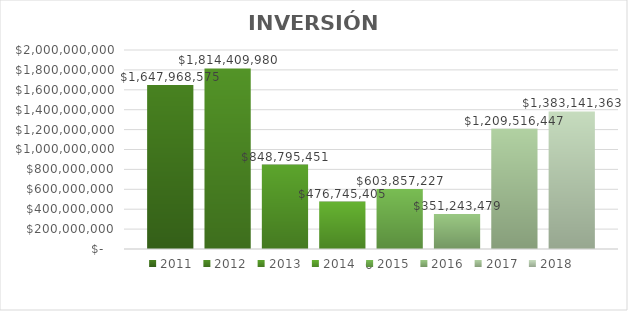
| Category | 2011 | 2012 | 2013 | 2014 | 2015 | 2016 | 2017 | 2018 |
|---|---|---|---|---|---|---|---|---|
| 0 | 1647968575 | 1814409980 | 848795451 | 476745404.577 | 603857227 | 351243479.06 | 1209516446.97 | 1383141362.59 |